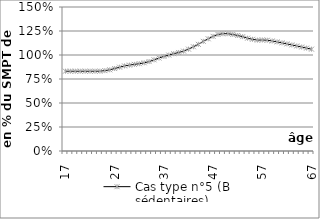
| Category | Cas type n°5 (B sédentaires) |
|---|---|
| 17.0 | 0.831 |
| 18.0 | 0.831 |
| 19.0 | 0.831 |
| 20.0 | 0.831 |
| 21.0 | 0.831 |
| 22.0 | 0.831 |
| 23.0 | 0.831 |
| 24.0 | 0.832 |
| 25.0 | 0.837 |
| 26.0 | 0.846 |
| 27.0 | 0.859 |
| 28.0 | 0.873 |
| 29.0 | 0.886 |
| 30.0 | 0.895 |
| 31.0 | 0.903 |
| 32.0 | 0.909 |
| 33.0 | 0.919 |
| 34.0 | 0.931 |
| 35.0 | 0.949 |
| 36.0 | 0.968 |
| 37.0 | 0.985 |
| 38.0 | 0.999 |
| 39.0 | 1.013 |
| 40.0 | 1.026 |
| 41.0 | 1.04 |
| 42.0 | 1.061 |
| 43.0 | 1.086 |
| 44.0 | 1.111 |
| 45.0 | 1.142 |
| 46.0 | 1.169 |
| 47.0 | 1.194 |
| 48.0 | 1.214 |
| 49.0 | 1.222 |
| 50.0 | 1.222 |
| 51.0 | 1.214 |
| 52.0 | 1.203 |
| 53.0 | 1.191 |
| 54.0 | 1.175 |
| 55.0 | 1.164 |
| 56.0 | 1.155 |
| 57.0 | 1.156 |
| 58.0 | 1.154 |
| 59.0 | 1.146 |
| 60.0 | 1.137 |
| 61.0 | 1.126 |
| 62.0 | 1.116 |
| 63.0 | 1.105 |
| 64.0 | 1.094 |
| 65.0 | 1.083 |
| 66.0 | 1.072 |
| 67.0 | 1.061 |